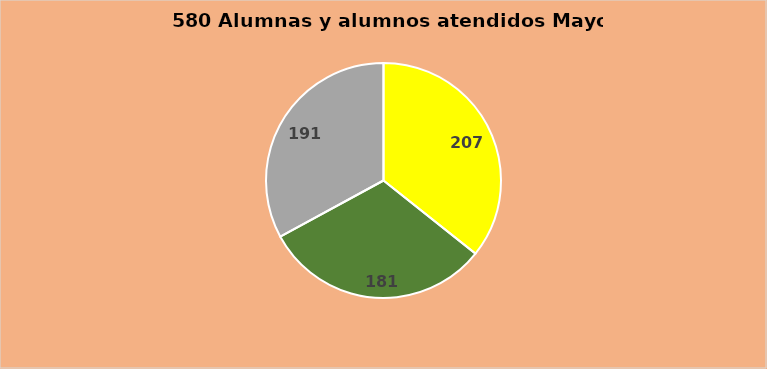
| Category | Series 0 |
|---|---|
| Base | 207 |
| Cooperación | 182 |
| Delegaciones | 191 |